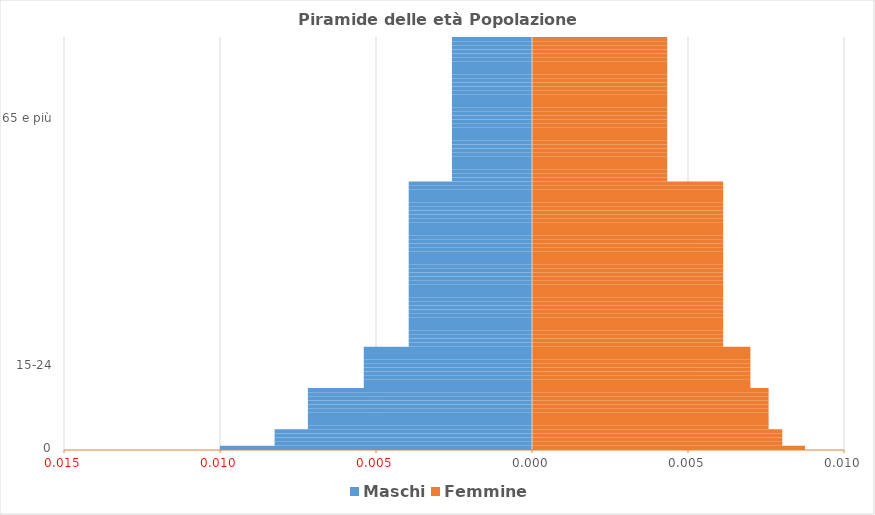
| Category | Maschi | Femmine |
|---|---|---|
| 0 | -0.01 | 0.009 |
|  | -0.008 | 0.008 |
|  | -0.008 | 0.008 |
| 1-4 | -0.008 | 0.008 |
|  | -0.008 | 0.008 |
|  | -0.007 | 0.008 |
|  | -0.007 | 0.008 |
|  | -0.007 | 0.008 |
|  | -0.007 | 0.008 |
|  | -0.007 | 0.008 |
| 5-14 | -0.007 | 0.008 |
|  | -0.007 | 0.008 |
|  | -0.007 | 0.008 |
|  | -0.007 | 0.008 |
|  | -0.007 | 0.008 |
|  | -0.005 | 0.007 |
|  | -0.005 | 0.007 |
|  | -0.005 | 0.007 |
|  | -0.005 | 0.007 |
|  | -0.005 | 0.007 |
| 15-24 | -0.005 | 0.007 |
|  | -0.005 | 0.007 |
|  | -0.005 | 0.007 |
|  | -0.005 | 0.007 |
|  | -0.005 | 0.007 |
|  | -0.004 | 0.006 |
|  | -0.004 | 0.006 |
|  | -0.004 | 0.006 |
|  | -0.004 | 0.006 |
|  | -0.004 | 0.006 |
|  | -0.004 | 0.006 |
|  | -0.004 | 0.006 |
|  | -0.004 | 0.006 |
|  | -0.004 | 0.006 |
|  | -0.004 | 0.006 |
|  | -0.004 | 0.006 |
|  | -0.004 | 0.006 |
|  | -0.004 | 0.006 |
|  | -0.004 | 0.006 |
|  | -0.004 | 0.006 |
|  | -0.004 | 0.006 |
|  | -0.004 | 0.006 |
|  | -0.004 | 0.006 |
|  | -0.004 | 0.006 |
|  | -0.004 | 0.006 |
| 25-64 | -0.004 | 0.006 |
|  | -0.004 | 0.006 |
|  | -0.004 | 0.006 |
|  | -0.004 | 0.006 |
|  | -0.004 | 0.006 |
|  | -0.004 | 0.006 |
|  | -0.004 | 0.006 |
|  | -0.004 | 0.006 |
|  | -0.004 | 0.006 |
|  | -0.004 | 0.006 |
|  | -0.004 | 0.006 |
|  | -0.004 | 0.006 |
|  | -0.004 | 0.006 |
|  | -0.004 | 0.006 |
|  | -0.004 | 0.006 |
|  | -0.004 | 0.006 |
|  | -0.004 | 0.006 |
|  | -0.004 | 0.006 |
|  | -0.004 | 0.006 |
|  | -0.004 | 0.006 |
|  | -0.003 | 0.004 |
|  | -0.003 | 0.004 |
|  | -0.003 | 0.004 |
|  | -0.003 | 0.004 |
|  | -0.003 | 0.004 |
|  | -0.003 | 0.004 |
|  | -0.003 | 0.004 |
|  | -0.003 | 0.004 |
|  | -0.003 | 0.004 |
|  | -0.003 | 0.004 |
|  | -0.003 | 0.004 |
|  | -0.003 | 0.004 |
|  | -0.003 | 0.004 |
|  | -0.003 | 0.004 |
|  | -0.003 | 0.004 |
| 65 e più | -0.003 | 0.004 |